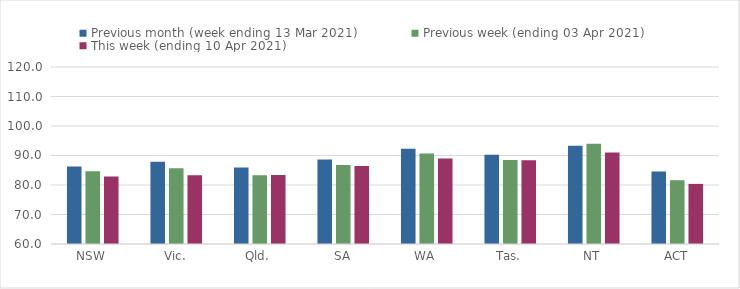
| Category | Previous month (week ending 13 Mar 2021) | Previous week (ending 03 Apr 2021) | This week (ending 10 Apr 2021) |
|---|---|---|---|
| NSW | 86.27 | 84.66 | 82.86 |
| Vic. | 87.88 | 85.68 | 83.3 |
| Qld. | 85.97 | 83.33 | 83.37 |
| SA | 88.66 | 86.81 | 86.43 |
| WA | 92.3 | 90.69 | 89 |
| Tas. | 90.29 | 88.5 | 88.41 |
| NT | 93.31 | 93.95 | 91.04 |
| ACT | 84.59 | 81.62 | 80.38 |